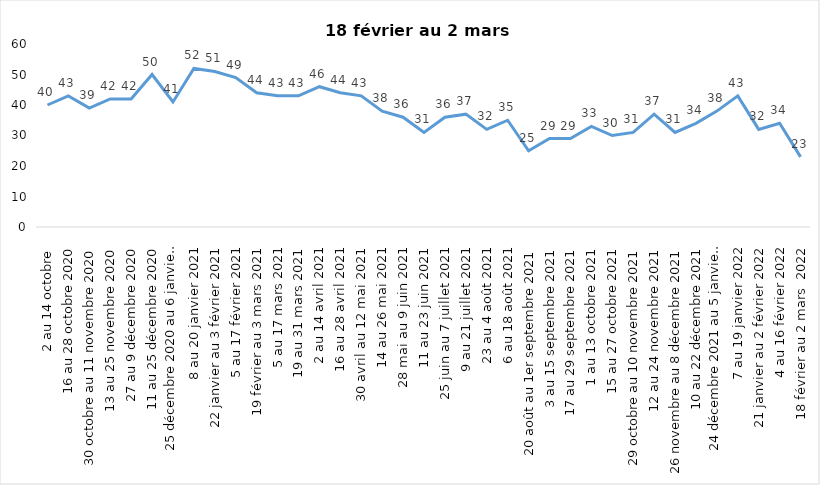
| Category | Toujours aux trois mesures |
|---|---|
| 2 au 14 octobre  | 40 |
| 16 au 28 octobre 2020 | 43 |
| 30 octobre au 11 novembre 2020 | 39 |
| 13 au 25 novembre 2020 | 42 |
| 27 au 9 décembre 2020 | 42 |
| 11 au 25 décembre 2020 | 50 |
| 25 décembre 2020 au 6 janvier 2021 | 41 |
| 8 au 20 janvier 2021 | 52 |
| 22 janvier au 3 février 2021 | 51 |
| 5 au 17 février 2021 | 49 |
| 19 février au 3 mars 2021 | 44 |
| 5 au 17 mars 2021 | 43 |
| 19 au 31 mars 2021 | 43 |
| 2 au 14 avril 2021 | 46 |
| 16 au 28 avril 2021 | 44 |
| 30 avril au 12 mai 2021 | 43 |
| 14 au 26 mai 2021 | 38 |
| 28 mai au 9 juin 2021 | 36 |
| 11 au 23 juin 2021 | 31 |
| 25 juin au 7 juillet 2021 | 36 |
| 9 au 21 juillet 2021 | 37 |
| 23 au 4 août 2021 | 32 |
| 6 au 18 août 2021 | 35 |
| 20 août au 1er septembre 2021 | 25 |
| 3 au 15 septembre 2021 | 29 |
| 17 au 29 septembre 2021 | 29 |
| 1 au 13 octobre 2021 | 33 |
| 15 au 27 octobre 2021 | 30 |
| 29 octobre au 10 novembre 2021 | 31 |
| 12 au 24 novembre 2021 | 37 |
| 26 novembre au 8 décembre 2021 | 31 |
| 10 au 22 décembre 2021 | 34 |
| 24 décembre 2021 au 5 janvier 2022 2022 | 38 |
| 7 au 19 janvier 2022 | 43 |
| 21 janvier au 2 février 2022 | 32 |
| 4 au 16 février 2022 | 34 |
| 18 février au 2 mars  2022 | 23 |